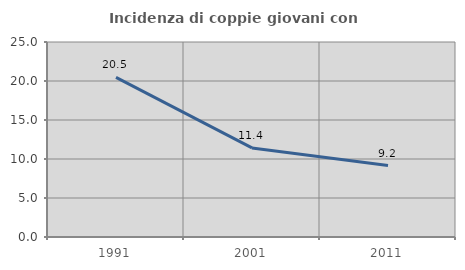
| Category | Incidenza di coppie giovani con figli |
|---|---|
| 1991.0 | 20.46 |
| 2001.0 | 11.422 |
| 2011.0 | 9.167 |